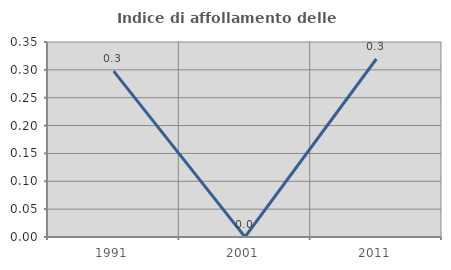
| Category | Indice di affollamento delle abitazioni  |
|---|---|
| 1991.0 | 0.298 |
| 2001.0 | 0 |
| 2011.0 | 0.319 |